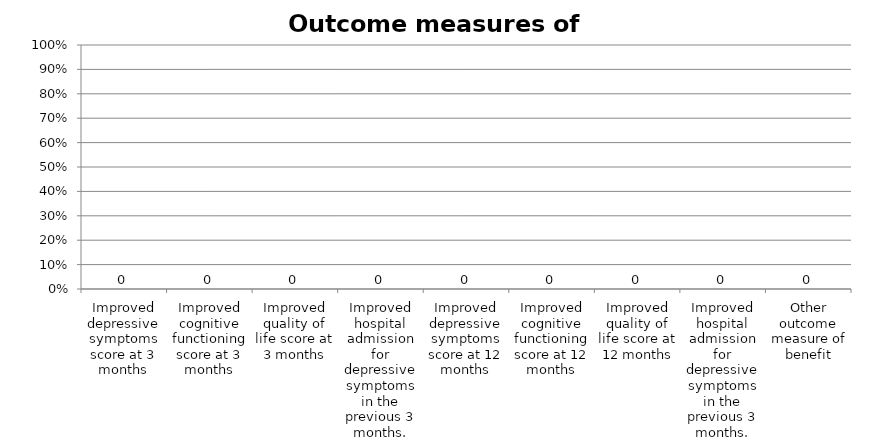
| Category | Series 0 |
|---|---|
| Improved depressive symptoms score at 3 months | 0 |
| Improved cognitive functioning score at 3 months | 0 |
| Improved quality of life score at 3 months | 0 |
| Improved hospital admission for depressive symptoms in the previous 3 months. Measure at 3 months | 0 |
| Improved depressive symptoms score at 12 months | 0 |
| Improved cognitive functioning score at 12 months | 0 |
| Improved quality of life score at 12 months | 0 |
| Improved hospital admission for depressive symptoms in the previous 3 months. Measure at 12 months | 0 |
| Other outcome measure of benefit | 0 |